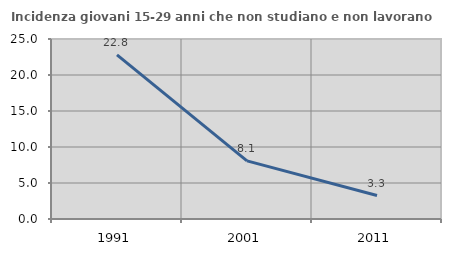
| Category | Incidenza giovani 15-29 anni che non studiano e non lavorano  |
|---|---|
| 1991.0 | 22.807 |
| 2001.0 | 8.079 |
| 2011.0 | 3.263 |